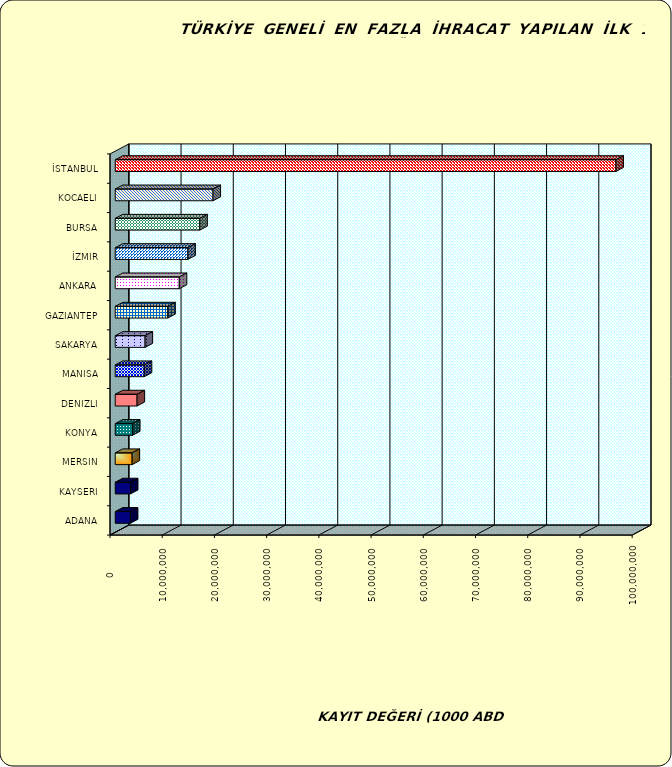
| Category | Series 0 |
|---|---|
| İSTANBUL | 95895425.97 |
| KOCAELI | 18727378.635 |
| BURSA | 16202578.905 |
| İZMIR | 13913634.226 |
| ANKARA | 12264514.622 |
| GAZIANTEP | 10071030.602 |
| SAKARYA | 5717967.624 |
| MANISA | 5560678.393 |
| DENIZLI | 4186960.163 |
| KONYA | 3305985.493 |
| MERSIN | 3232719.333 |
| KAYSERI | 2913179.614 |
| ADANA | 2901187.512 |